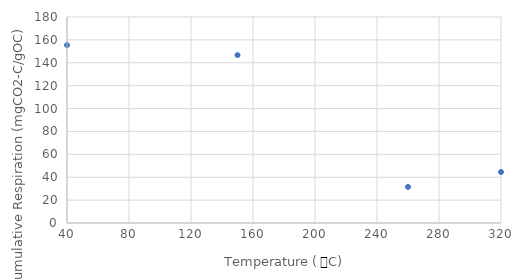
| Category | Total C (mg/g) |
|---|---|
| 40.0 | 155.451 |
| 150.0 | 146.706 |
| 260.0 | 31.539 |
| 320.0 | 44.579 |